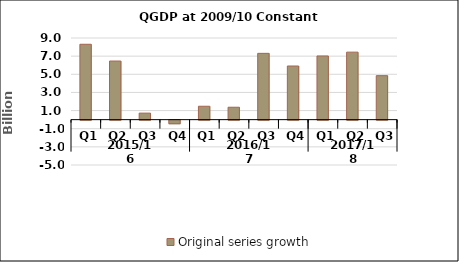
| Category | Original series growth |
|---|---|
| 0 | 8.308 |
| 1 | 6.46 |
| 2 | 0.717 |
| 3 | -0.396 |
| 4 | 1.475 |
| 5 | 1.367 |
| 6 | 7.308 |
| 7 | 5.913 |
| 8 | 7.021 |
| 9 | 7.44 |
| 10 | 4.848 |